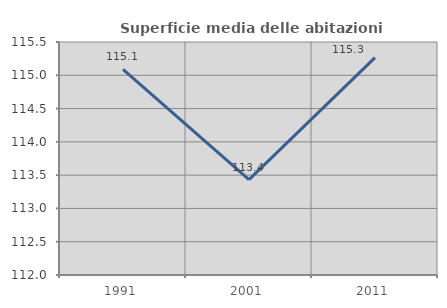
| Category | Superficie media delle abitazioni occupate |
|---|---|
| 1991.0 | 115.087 |
| 2001.0 | 113.433 |
| 2011.0 | 115.266 |